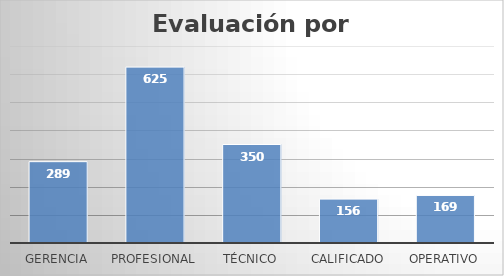
| Category | Series 0 |
|---|---|
| Gerencia | 289 |
| Profesional | 625 |
| Técnico | 350 |
| Calificado | 156 |
| Operativo | 169 |